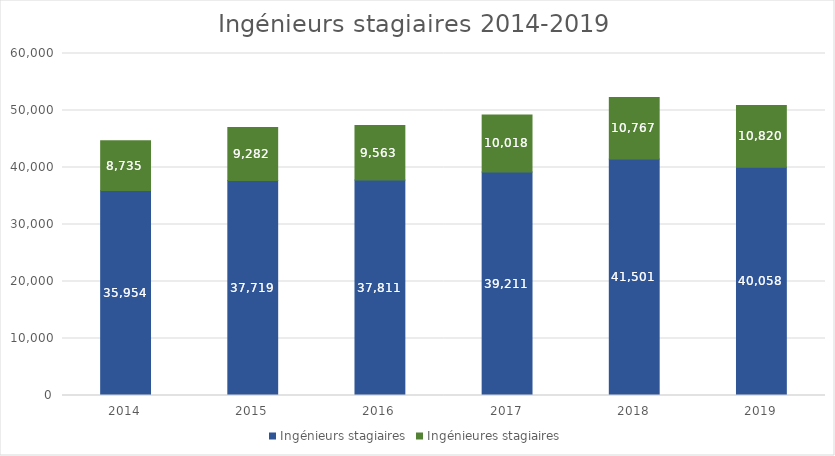
| Category | Ingénieurs stagiaires | Ingénieures stagiaires |
|---|---|---|
| 2014.0 | 35954 | 8735 |
| 2015.0 | 37719 | 9282 |
| 2016.0 | 37811 | 9563 |
| 2017.0 | 39211 | 10018 |
| 2018.0 | 41501 | 10767 |
| 2019.0 | 40058 | 10820 |